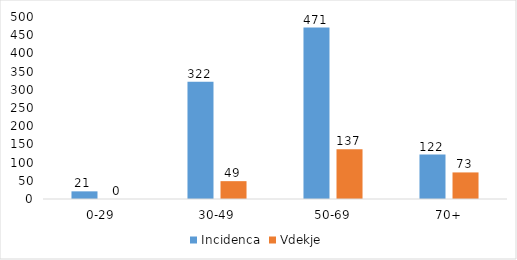
| Category | Incidenca | Vdekje |
|---|---|---|
| 0-29 | 21 | 0 |
| 30-49 | 322 | 49 |
| 50-69 | 471 | 137 |
| 70+ | 122 | 73 |